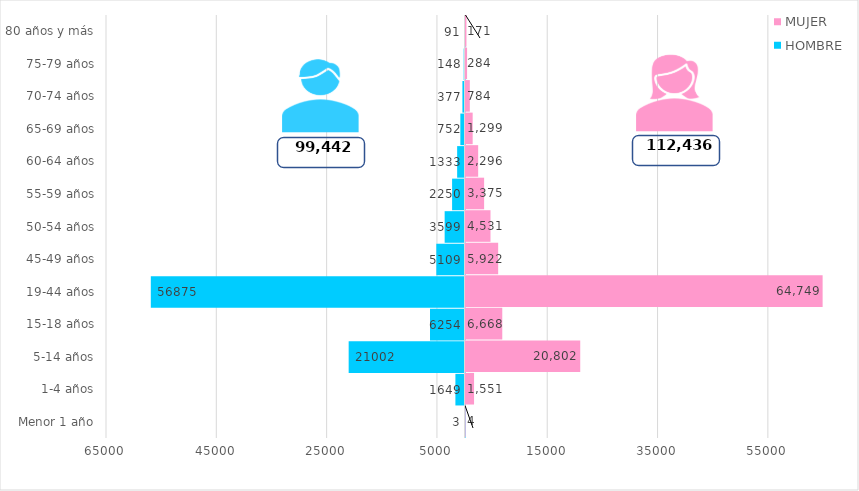
| Category | HOMBRE | MUJER |
|---|---|---|
| Menor 1 año | -3 | 4 |
| 1-4 años | -1649 | 1551 |
| 5-14 años | -21002 | 20802 |
| 15-18 años | -6254 | 6668 |
| 19-44 años | -56875 | 64749 |
| 45-49 años | -5109 | 5922 |
| 50-54 años | -3599 | 4531 |
| 55-59 años | -2250 | 3375 |
| 60-64 años | -1333 | 2296 |
| 65-69 años | -752 | 1299 |
| 70-74 años | -377 | 784 |
| 75-79 años | -148 | 284 |
| 80 años y más | -91 | 171 |